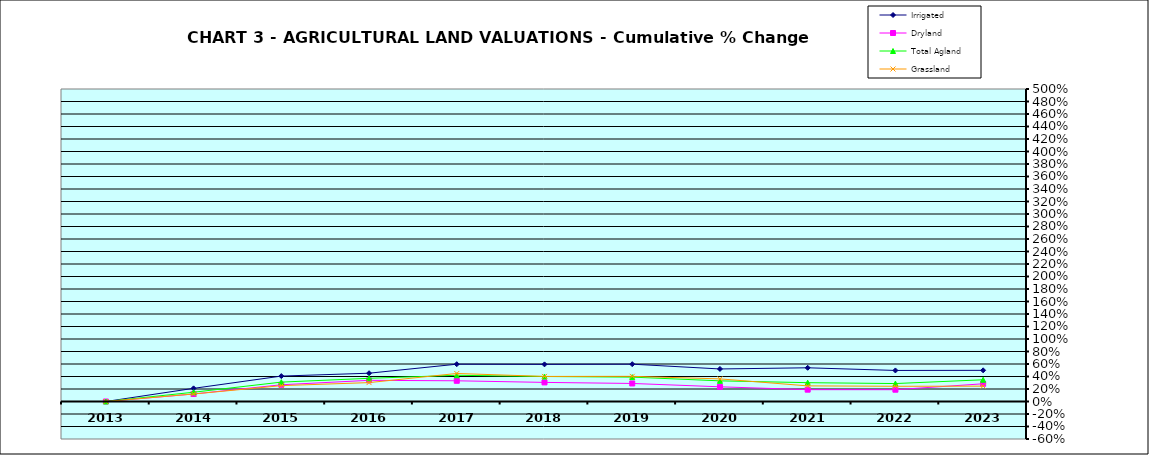
| Category | Irrigated | Dryland | Total Agland | Grassland |
|---|---|---|---|---|
| 2013.0 | 0 | 0 | 0 | 0 |
| 2014.0 | 0.21 | 0.12 | 0.148 | 0.12 |
| 2015.0 | 0.407 | 0.268 | 0.31 | 0.254 |
| 2016.0 | 0.453 | 0.339 | 0.371 | 0.302 |
| 2017.0 | 0.597 | 0.331 | 0.419 | 0.448 |
| 2018.0 | 0.594 | 0.306 | 0.4 | 0.401 |
| 2019.0 | 0.597 | 0.289 | 0.39 | 0.403 |
| 2020.0 | 0.521 | 0.235 | 0.33 | 0.362 |
| 2021.0 | 0.539 | 0.189 | 0.301 | 0.25 |
| 2022.0 | 0.497 | 0.189 | 0.287 | 0.243 |
| 2023.0 | 0.499 | 0.283 | 0.348 | 0.246 |